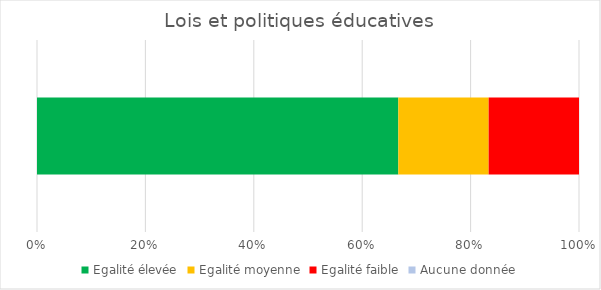
| Category | Egalité élevée | Egalité moyenne | Egalité faible | Aucune donnée |
|---|---|---|---|---|
| 0 | 4 | 1 | 1 | 0 |